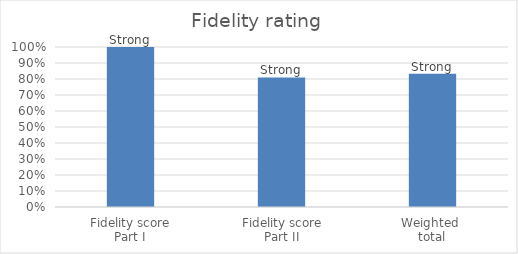
| Category | Series 0 |
|---|---|
| Fidelity score
Part I | 1 |
| Fidelity score
Part II | 0.81 |
| Weighted 
total | 0.833 |